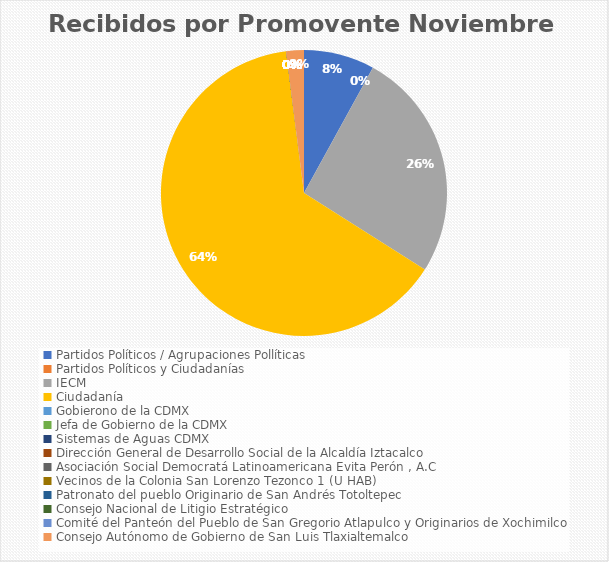
| Category | Recibidos por Promovente Noviembre |
|---|---|
| Partidos Políticos / Agrupaciones Pollíticas | 4 |
| Partidos Políticos y Ciudadanías | 0 |
| IECM | 13 |
| Ciudadanía  | 32 |
| Gobierono de la CDMX | 0 |
| Jefa de Gobierno de la CDMX | 0 |
| Sistemas de Aguas CDMX | 0 |
| Dirección General de Desarrollo Social de la Alcaldía Iztacalco | 0 |
| Asociación Social Democratá Latinoamericana Evita Perón , A.C | 0 |
| Vecinos de la Colonia San Lorenzo Tezonco 1 (U HAB) | 0 |
| Patronato del pueblo Originario de San Andrés Totoltepec | 0 |
| Consejo Nacional de Litigio Estratégico | 0 |
| Comité del Panteón del Pueblo de San Gregorio Atlapulco y Originarios de Xochimilco | 0 |
| Consejo Autónomo de Gobierno de San Luis Tlaxialtemalco | 1 |